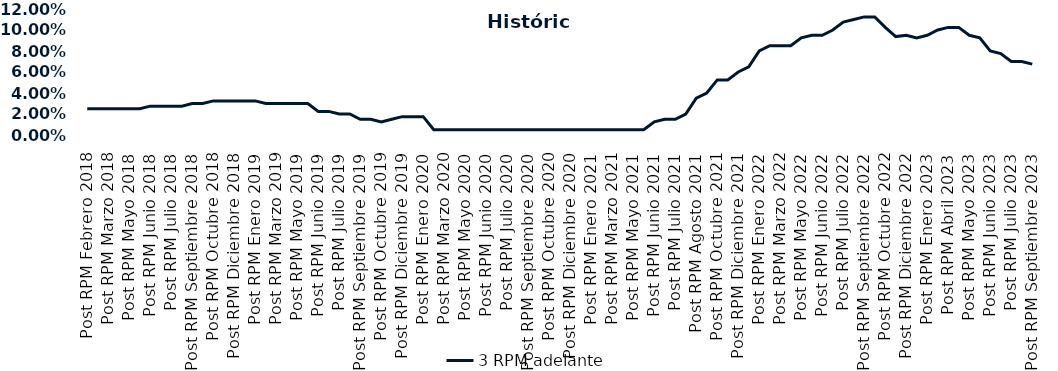
| Category | 3 RPM adelante |
|---|---|
| Post RPM Febrero 2018 | 0.025 |
| Pre RPM Marzo 2018 | 0.025 |
| Post RPM Marzo 2018 | 0.025 |
| Pre RPM Mayo 2018 | 0.025 |
| Post RPM Mayo 2018 | 0.025 |
| Pre RPM Junio 2018 | 0.025 |
| Post RPM Junio 2018 | 0.028 |
| Pre RPM Julio 2018 | 0.028 |
| Post RPM Julio 2018 | 0.028 |
| Pre RPM Septiembre 2018 | 0.028 |
| Post RPM Septiembre 2018 | 0.03 |
| Pre RPM Octubre 2018 | 0.03 |
| Post RPM Octubre 2018 | 0.032 |
| Pre RPM Diciembre 2018 | 0.032 |
| Post RPM Diciembre 2018 | 0.032 |
| Pre RPM Enero 2019 | 0.032 |
| Post RPM Enero 2019 | 0.032 |
| Pre RPM Marzo 2019 | 0.03 |
| Post RPM Marzo 2019 | 0.03 |
| Pre RPM Mayo 2019 | 0.03 |
| Post RPM Mayo 2019 | 0.03 |
| Pre RPM Junio 2019 | 0.03 |
| Post RPM Junio 2019 | 0.022 |
| Pre RPM Julio 2019 | 0.022 |
| Post RPM Julio 2019 | 0.02 |
| Pre RPM Septiembre 2019 | 0.02 |
| Post RPM Septiembre 2019 | 0.015 |
| Pre RPM Octubre 2019 | 0.015 |
| Post RPM Octubre 2019 | 0.012 |
| Pre RPM Diciembre 2019 | 0.015 |
| Post RPM Diciembre 2019 | 0.018 |
| Pre RPM Enero 2020 | 0.018 |
| Post RPM Enero 2020 | 0.018 |
| Pre RPM Marzo 2020 | 0.005 |
| Post RPM Marzo 2020 | 0.005 |
| Pre RPM Mayo 2020 | 0.005 |
| Post RPM Mayo 2020 | 0.005 |
| Pre RPM Junio 2020 | 0.005 |
| Post RPM Junio 2020 | 0.005 |
| Pre RPM Julio 2020 | 0.005 |
| Post RPM Julio 2020 | 0.005 |
| Pre RPM Septiembre 2020 | 0.005 |
| Post RPM Septiembre 2020 | 0.005 |
| Pre RPM Octubre 2020 | 0.005 |
| Post RPM Octubre 2020 | 0.005 |
| Pre RPM Diciembre 2020 | 0.005 |
| Post RPM Diciembre 2020 | 0.005 |
| Pre RPM Enero 2021 | 0.005 |
| Post RPM Enero 2021 | 0.005 |
| Pre RPM Marzo 2021 | 0.005 |
| Post RPM Marzo 2021 | 0.005 |
| Pre RPM Mayo 2021 | 0.005 |
| Post RPM Mayo 2021 | 0.005 |
| Pre RPM Junio 2021 | 0.005 |
| Post RPM Junio 2021 | 0.012 |
| Pre RPM Julio 2021 | 0.015 |
| Post RPM Julio 2021 | 0.015 |
| Pre RPM Agosto 2021 | 0.02 |
| Post RPM Agosto 2021 | 0.035 |
| Pre RPM Octubre 2021 | 0.04 |
| Post RPM Octubre 2021 | 0.052 |
| Pre RPM Diciembre 2021 | 0.052 |
| Post RPM Diciembre 2021 | 0.06 |
| Pre RPM Enero 2022 | 0.065 |
| Post RPM Enero 2022 | 0.08 |
| Pre RPM Marzo 2022 | 0.085 |
| Post RPM Marzo 2022 | 0.085 |
| Pre RPM Mayo 2022 | 0.085 |
| Post RPM Mayo 2022 | 0.092 |
| Pre RPM Junio 2022 | 0.095 |
| Post RPM Junio 2022 | 0.095 |
| Pre RPM Julio 2022 | 0.1 |
| Post RPM Julio 2022 | 0.108 |
| Pre RPM Septiembre 2022 | 0.11 |
| Post RPM Septiembre 2022 | 0.112 |
| Pre RPM Octubre 2022 | 0.112 |
| Post RPM Octubre 2022 | 0.102 |
| Pre RPM Diciembre 2022 | 0.094 |
| Post RPM Diciembre 2022 | 0.095 |
| Pre RPM Enero 2023 | 0.092 |
| Post RPM Enero 2023 | 0.095 |
| Pre RPM Abril 2023 | 0.1 |
| Post RPM Abril 2023 | 0.102 |
| Pre RPM Mayo 2023 | 0.102 |
| Post RPM Mayo 2023 | 0.095 |
| Pre RPM Junio 2023 | 0.092 |
| Post RPM Junio 2023 | 0.08 |
| Pre RPM Julio 2023 | 0.078 |
| Post RPM Julio 2023 | 0.07 |
| Pre RPM Septiembre 2023 | 0.07 |
| Post RPM Septiembre 2023 | 0.068 |